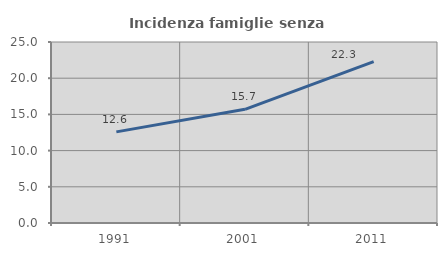
| Category | Incidenza famiglie senza nuclei |
|---|---|
| 1991.0 | 12.588 |
| 2001.0 | 15.704 |
| 2011.0 | 22.298 |